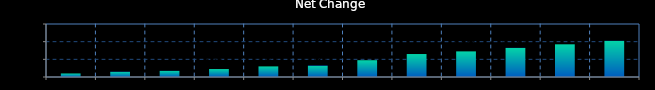
| Category | Series 0 |
|---|---|
| 0 | 0.04 |
| 1 | 0.06 |
| 2 | 0.07 |
| 3 | 0.09 |
| 4 | 0.12 |
| 5 | 0.13 |
| 6 | 0.19 |
| 7 | 0.26 |
| 8 | 0.29 |
| 9 | 0.33 |
| 10 | 0.37 |
| 11 | 0.41 |